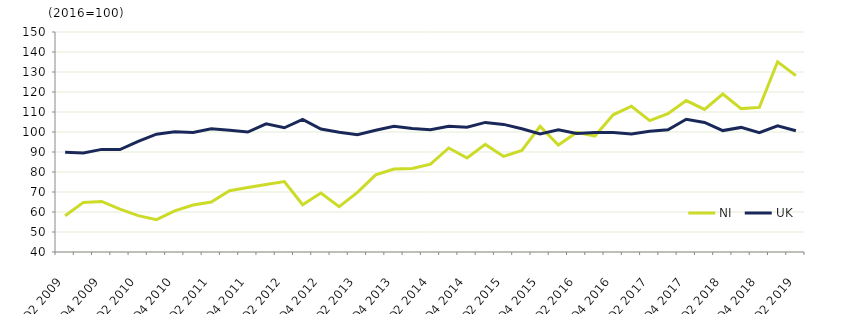
| Category | NI  | UK  |
|---|---|---|
| Q2 2009 | 58.1 | 89.9 |
|  | 64.8 | 89.5 |
| Q4 2009 | 65.3 | 91.3 |
|  | 61.4 | 91.2 |
| Q2 2010 | 58.2 | 95.3 |
|  | 56.2 | 98.9 |
| Q4 2010 | 60.6 | 100.1 |
|  | 63.5 | 99.8 |
| Q2 2011 | 65 | 101.6 |
|  | 70.6 | 100.9 |
| Q4 2011 | 72.2 | 100 |
|  | 73.7 | 104.1 |
| Q2 2012 | 75.2 | 102.1 |
|  | 63.6 | 106.3 |
| Q4 2012 | 69.5 | 101.5 |
|  | 62.7 | 99.9 |
| Q2 2013 | 69.8 | 98.6 |
|  | 78.6 | 100.9 |
| Q4 2013 | 81.5 | 102.9 |
|  | 81.8 | 101.7 |
| Q2 2014 | 83.9 | 101.1 |
|  | 92 | 102.9 |
| Q4 2014 | 87 | 102.4 |
|  | 93.8 | 104.8 |
| Q2 2015 | 87.8 | 103.8 |
|  | 90.8 | 101.6 |
| Q4 2015 | 102.8 | 99 |
|  | 93.5 | 101.1 |
| Q2 2016 | 99.8 | 99.3 |
|  | 98 | 99.8 |
| Q4 2016 | 108.6 | 99.7 |
|  | 112.9 | 99 |
| Q2 2017 | 105.7 | 100.4 |
|  | 109.2 | 101.1 |
| Q4 2017 | 115.7 | 106.4 |
|  | 111.3 | 104.8 |
| Q2 2018 | 119 | 100.7 |
|  | 111.7 | 102.3 |
| Q4 2018 | 112.3 | 99.7 |
|  | 135.1 | 103.1 |
| Q2 2019 | 128.2 | 100.6 |